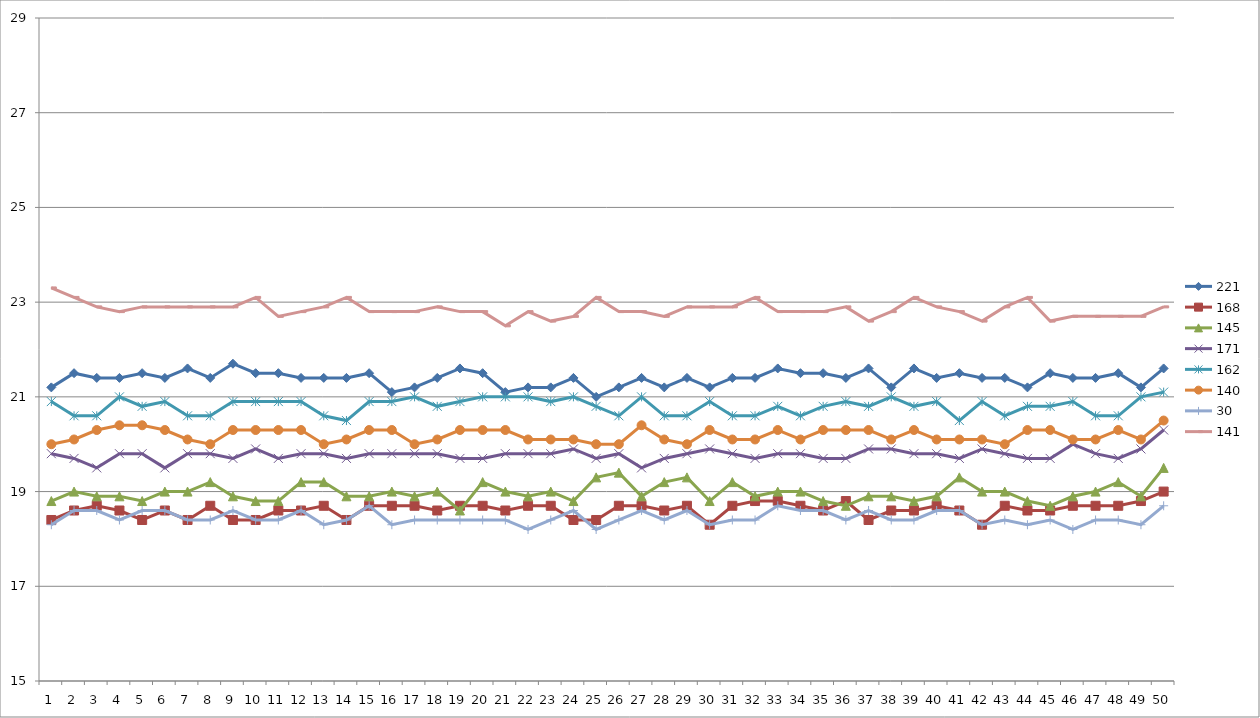
| Category | 221 | 168 | 145 | 171 | 162 | 140 | 30 | 141 |
|---|---|---|---|---|---|---|---|---|
| 0 | 21.2 | 18.4 | 18.8 | 19.8 | 20.9 | 20 | 18.3 | 23.3 |
| 1 | 21.5 | 18.6 | 19 | 19.7 | 20.6 | 20.1 | 18.6 | 23.1 |
| 2 | 21.4 | 18.7 | 18.9 | 19.5 | 20.6 | 20.3 | 18.6 | 22.9 |
| 3 | 21.4 | 18.6 | 18.9 | 19.8 | 21 | 20.4 | 18.4 | 22.8 |
| 4 | 21.5 | 18.4 | 18.8 | 19.8 | 20.8 | 20.4 | 18.6 | 22.9 |
| 5 | 21.4 | 18.6 | 19 | 19.5 | 20.9 | 20.3 | 18.6 | 22.9 |
| 6 | 21.6 | 18.4 | 19 | 19.8 | 20.6 | 20.1 | 18.4 | 22.9 |
| 7 | 21.4 | 18.7 | 19.2 | 19.8 | 20.6 | 20 | 18.4 | 22.9 |
| 8 | 21.7 | 18.4 | 18.9 | 19.7 | 20.9 | 20.3 | 18.6 | 22.9 |
| 9 | 21.5 | 18.4 | 18.8 | 19.9 | 20.9 | 20.3 | 18.4 | 23.1 |
| 10 | 21.5 | 18.6 | 18.8 | 19.7 | 20.9 | 20.3 | 18.4 | 22.7 |
| 11 | 21.4 | 18.6 | 19.2 | 19.8 | 20.9 | 20.3 | 18.6 | 22.8 |
| 12 | 21.4 | 18.7 | 19.2 | 19.8 | 20.6 | 20 | 18.3 | 22.9 |
| 13 | 21.4 | 18.4 | 18.9 | 19.7 | 20.5 | 20.1 | 18.4 | 23.1 |
| 14 | 21.5 | 18.7 | 18.9 | 19.8 | 20.9 | 20.3 | 18.7 | 22.8 |
| 15 | 21.1 | 18.7 | 19 | 19.8 | 20.9 | 20.3 | 18.3 | 22.8 |
| 16 | 21.2 | 18.7 | 18.9 | 19.8 | 21 | 20 | 18.4 | 22.8 |
| 17 | 21.4 | 18.6 | 19 | 19.8 | 20.8 | 20.1 | 18.4 | 22.9 |
| 18 | 21.6 | 18.7 | 18.6 | 19.7 | 20.9 | 20.3 | 18.4 | 22.8 |
| 19 | 21.5 | 18.7 | 19.2 | 19.7 | 21 | 20.3 | 18.4 | 22.8 |
| 20 | 21.1 | 18.6 | 19 | 19.8 | 21 | 20.3 | 18.4 | 22.5 |
| 21 | 21.2 | 18.7 | 18.9 | 19.8 | 21 | 20.1 | 18.2 | 22.8 |
| 22 | 21.2 | 18.7 | 19 | 19.8 | 20.9 | 20.1 | 18.4 | 22.6 |
| 23 | 21.4 | 18.4 | 18.8 | 19.9 | 21 | 20.1 | 18.6 | 22.7 |
| 24 | 21 | 18.4 | 19.3 | 19.7 | 20.8 | 20 | 18.2 | 23.1 |
| 25 | 21.2 | 18.7 | 19.4 | 19.8 | 20.6 | 20 | 18.4 | 22.8 |
| 26 | 21.4 | 18.7 | 18.9 | 19.5 | 21 | 20.4 | 18.6 | 22.8 |
| 27 | 21.2 | 18.6 | 19.2 | 19.7 | 20.6 | 20.1 | 18.4 | 22.7 |
| 28 | 21.4 | 18.7 | 19.3 | 19.8 | 20.6 | 20 | 18.6 | 22.9 |
| 29 | 21.2 | 18.3 | 18.8 | 19.9 | 20.9 | 20.3 | 18.3 | 22.9 |
| 30 | 21.4 | 18.7 | 19.2 | 19.8 | 20.6 | 20.1 | 18.4 | 22.9 |
| 31 | 21.4 | 18.8 | 18.9 | 19.7 | 20.6 | 20.1 | 18.4 | 23.1 |
| 32 | 21.6 | 18.8 | 19 | 19.8 | 20.8 | 20.3 | 18.7 | 22.8 |
| 33 | 21.5 | 18.7 | 19 | 19.8 | 20.6 | 20.1 | 18.6 | 22.8 |
| 34 | 21.5 | 18.6 | 18.8 | 19.7 | 20.8 | 20.3 | 18.6 | 22.8 |
| 35 | 21.4 | 18.8 | 18.7 | 19.7 | 20.9 | 20.3 | 18.4 | 22.9 |
| 36 | 21.6 | 18.4 | 18.9 | 19.9 | 20.8 | 20.3 | 18.6 | 22.6 |
| 37 | 21.2 | 18.6 | 18.9 | 19.9 | 21 | 20.1 | 18.4 | 22.8 |
| 38 | 21.6 | 18.6 | 18.8 | 19.8 | 20.8 | 20.3 | 18.4 | 23.1 |
| 39 | 21.4 | 18.7 | 18.9 | 19.8 | 20.9 | 20.1 | 18.6 | 22.9 |
| 40 | 21.5 | 18.6 | 19.3 | 19.7 | 20.5 | 20.1 | 18.6 | 22.8 |
| 41 | 21.4 | 18.3 | 19 | 19.9 | 20.9 | 20.1 | 18.3 | 22.6 |
| 42 | 21.4 | 18.7 | 19 | 19.8 | 20.6 | 20 | 18.4 | 22.9 |
| 43 | 21.2 | 18.6 | 18.8 | 19.7 | 20.8 | 20.3 | 18.3 | 23.1 |
| 44 | 21.5 | 18.6 | 18.7 | 19.7 | 20.8 | 20.3 | 18.4 | 22.6 |
| 45 | 21.4 | 18.7 | 18.9 | 20 | 20.9 | 20.1 | 18.2 | 22.7 |
| 46 | 21.4 | 18.7 | 19 | 19.8 | 20.6 | 20.1 | 18.4 | 22.7 |
| 47 | 21.5 | 18.7 | 19.2 | 19.7 | 20.6 | 20.3 | 18.4 | 22.7 |
| 48 | 21.2 | 18.8 | 18.9 | 19.9 | 21 | 20.1 | 18.3 | 22.7 |
| 49 | 21.6 | 19 | 19.5 | 20.3 | 21.1 | 20.5 | 18.7 | 22.9 |